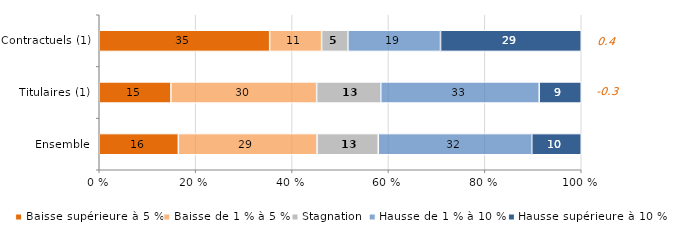
| Category | Baisse supérieure à 5 % | Baisse de 1 % à 5 % | Stagnation | Hausse de 1 % à 10 % | Hausse supérieure à 10 % |
|---|---|---|---|---|---|
| Ensemble | 16.411 | 28.771 | 12.708 | 31.841 | 10.27 |
| Titulaires (1) | 14.865 | 30.24 | 13.301 | 32.871 | 8.724 |
| Contractuels (1) | 35.357 | 10.777 | 5.448 | 19.225 | 29.193 |